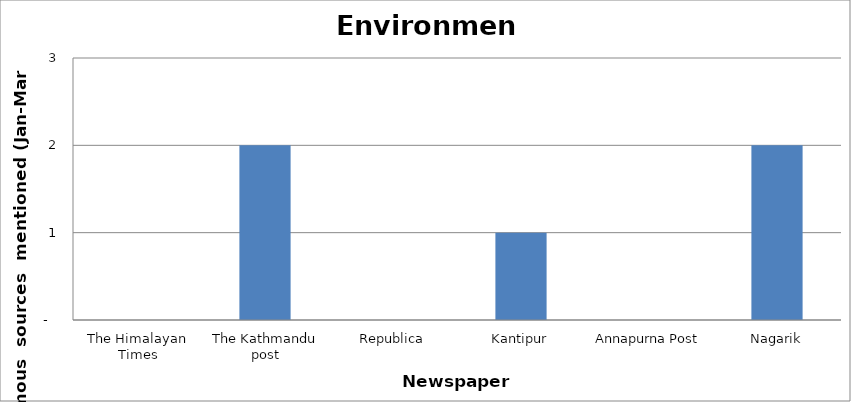
| Category | Environment |
|---|---|
| The Himalayan Times | 0 |
| The Kathmandu post | 2 |
| Republica | 0 |
| Kantipur | 1 |
| Annapurna Post | 0 |
| Nagarik | 2 |